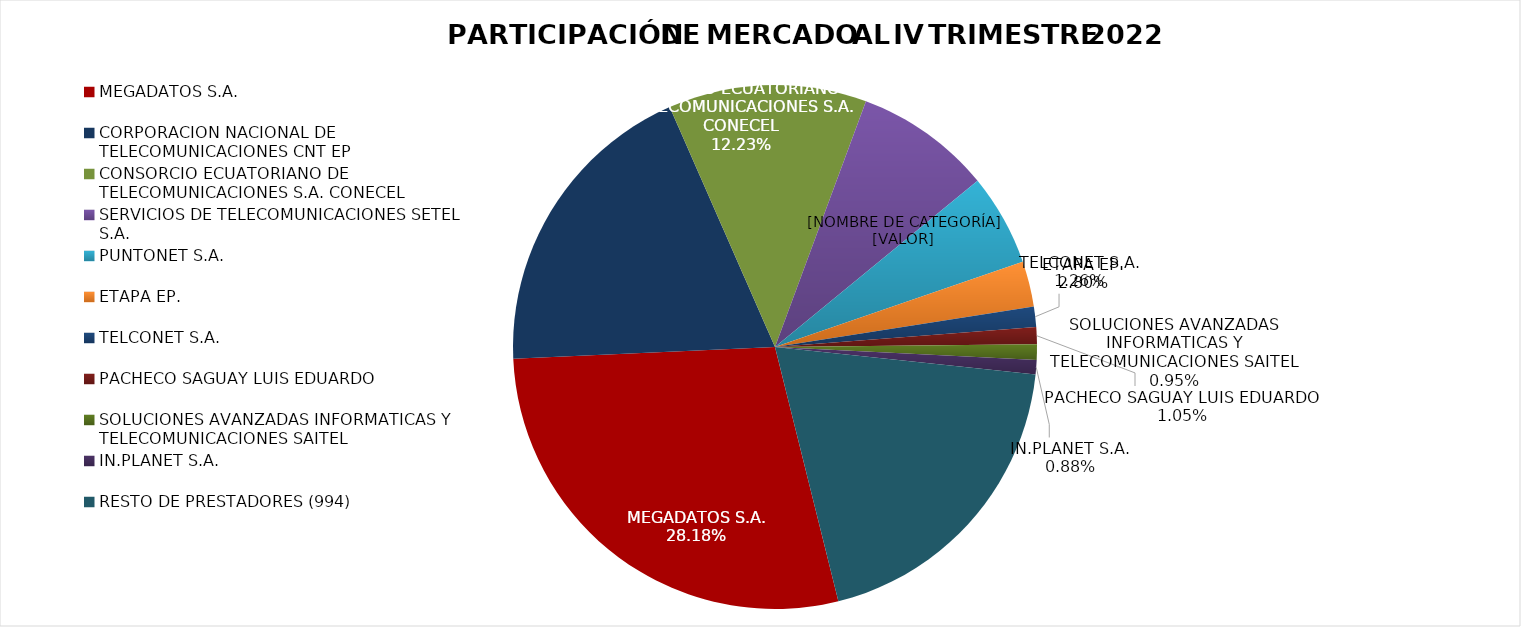
| Category | Series 0 |
|---|---|
| MEGADATOS S.A. | 0.282 |
| CORPORACION NACIONAL DE TELECOMUNICACIONES CNT EP | 0.191 |
| CONSORCIO ECUATORIANO DE TELECOMUNICACIONES S.A. CONECEL | 0.122 |
| SERVICIOS DE TELECOMUNICACIONES SETEL S.A. | 0.084 |
| PUNTONET S.A. | 0.057 |
| ETAPA EP. | 0.028 |
| TELCONET S.A. | 0.013 |
| PACHECO SAGUAY LUIS EDUARDO | 0.011 |
| SOLUCIONES AVANZADAS INFORMATICAS Y TELECOMUNICACIONES SAITEL | 0.01 |
| IN.PLANET S.A. | 0.009 |
| RESTO DE PRESTADORES (994)  | 0.194 |